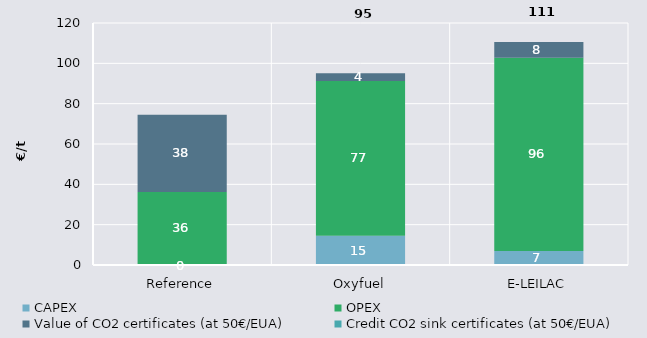
| Category | CAPEX | OPEX | Value of CO2 certificates (at 50€/EUA) | Credit CO2 sink certificates (at 50€/EUA) |
|---|---|---|---|---|
| 0 | 0 | 36.248 | 38.26 | 0 |
| 1 | 14.518 | 76.748 | 3.826 | 0 |
| 2 | 7 | 95.812 | 7.736 | 0 |